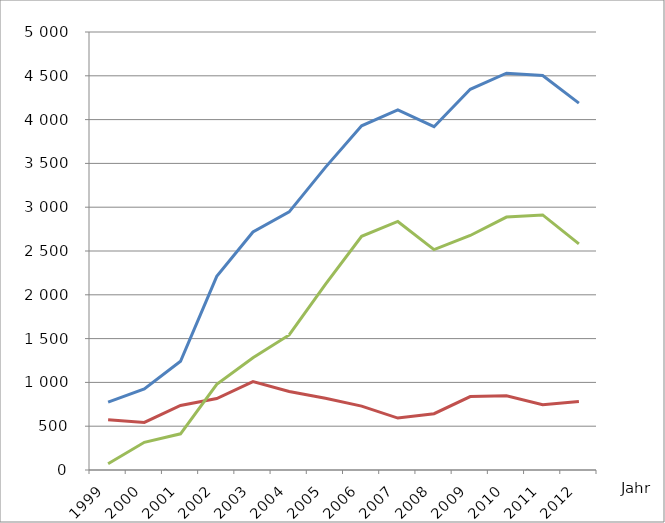
| Category | Verfahren
Insgesamt | von Unternehmen1 | von Verbrauchern |
|---|---|---|---|
| 1999.0 | 775 | 575 | 71 |
| 2000.0 | 926 | 543 | 316 |
| 2001.0 | 1241 | 737 | 413 |
| 2002.0 | 2211 | 816 | 978 |
| 2003.0 | 2717 | 1010 | 1281 |
| 2004.0 | 2947 | 896 | 1542 |
| 2005.0 | 3455 | 818 | 2119 |
| 2006.0 | 3929 | 729 | 2668 |
| 2007.0 | 4110 | 593 | 2837 |
| 2008.0 | 3919 | 643 | 2516 |
| 2009.0 | 4346 | 838 | 2677 |
| 2010.0 | 4530 | 847 | 2887 |
| 2011.0 | 4503 | 745 | 2912 |
| 2012.0 | 4188 | 781 | 2581 |